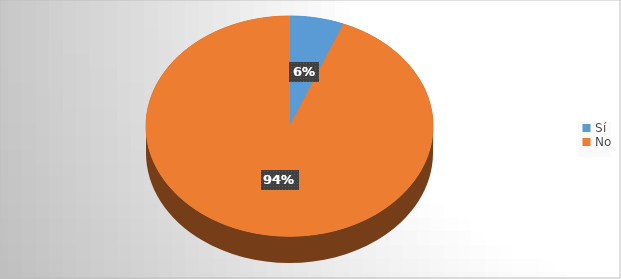
| Category | Series 0 |
|---|---|
| Sí | 5 |
| No | 77 |